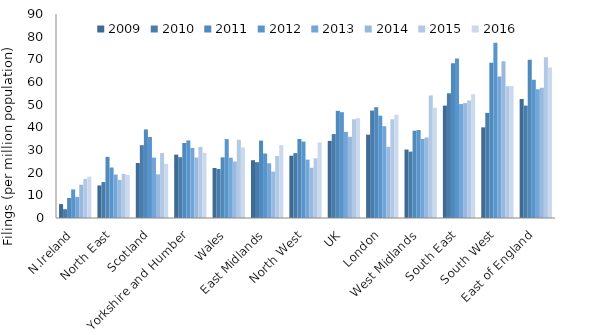
| Category | 2009 | 2010 | 2011 | 2012 | 2013 | 2014 | 2015 | 2016 |
|---|---|---|---|---|---|---|---|---|
| N.Ireland | 6.134 | 3.879 | 8.819 | 12.612 | 9.291 | 14.67 | 17.282 | 18.259 |
| North East | 14.367 | 15.849 | 26.96 | 22.288 | 19.153 | 16.802 | 19.432 | 18.962 |
| Scotland | 24.274 | 32.116 | 39.057 | 35.757 | 26.653 | 19.261 | 28.662 | 23.868 |
| Yorkshire and Humber | 27.952 | 26.833 | 33.093 | 34.232 | 30.912 | 26.679 | 31.351 | 28.752 |
| Wales | 22.047 | 21.639 | 26.764 | 34.807 | 26.603 | 24.903 | 34.526 | 31.158 |
| East Midlands | 25.494 | 24.628 | 34.161 | 28.461 | 24.139 | 20.486 | 27.368 | 32.173 |
| North West | 27.483 | 28.633 | 34.864 | 33.737 | 25.763 | 22.151 | 26.346 | 33.381 |
| UK | 34.018 | 37.014 | 47.278 | 46.684 | 38.015 | 35.838 | 43.588 | 44.068 |
| London | 36.764 | 47.386 | 48.876 | 45.135 | 40.516 | 31.387 | 43.58 | 45.517 |
| West Midlands | 30.21 | 29.285 | 38.512 | 38.812 | 34.892 | 35.531 | 54.078 | 48.615 |
| South East | 49.582 | 55.026 | 68.302 | 70.375 | 50.268 | 50.711 | 51.856 | 54.618 |
| South West | 39.986 | 46.376 | 68.48 | 77.347 | 62.481 | 69.146 | 58.123 | 58.194 |
| East of England | 52.509 | 49.592 | 69.767 | 60.942 | 56.766 | 57.49 | 70.929 | 66.389 |